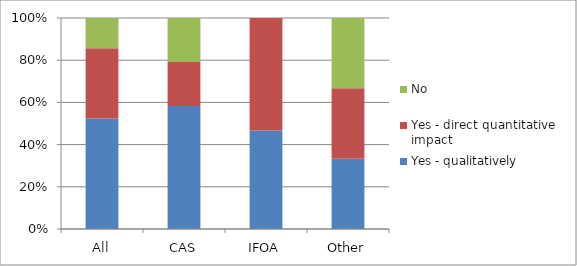
| Category | Yes - qualitatively | Yes - direct quantitative impact | No |
|---|---|---|---|
| All | 0.524 | 0.333 | 0.143 |
| CAS | 0.583 | 0.208 | 0.208 |
| IFOA | 0.467 | 0.533 | 0 |
| Other | 0.333 | 0.333 | 0.333 |